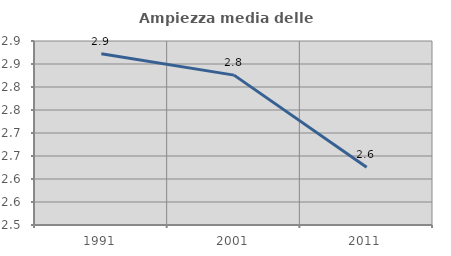
| Category | Ampiezza media delle famiglie |
|---|---|
| 1991.0 | 2.872 |
| 2001.0 | 2.826 |
| 2011.0 | 2.625 |